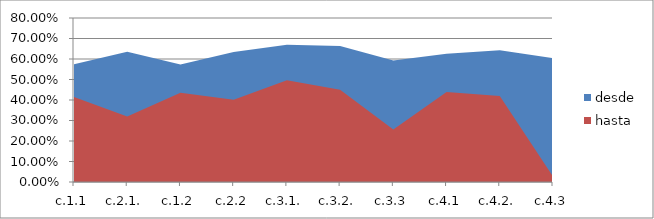
| Category | desde | hasta |
|---|---|---|
| c.1.1 | 0.574 | 0.415 |
| c.2.1. | 0.635 | 0.32 |
| c.1.2 | 0.573 | 0.436 |
| c.2.2 | 0.634 | 0.401 |
| c.3.1. | 0.669 | 0.496 |
| c.3.2. | 0.663 | 0.45 |
| c.3.3 | 0.593 | 0.256 |
| c.4.1 | 0.625 | 0.439 |
| c.4.2. | 0.642 | 0.419 |
| c.4.3 | 0.604 | 0.026 |